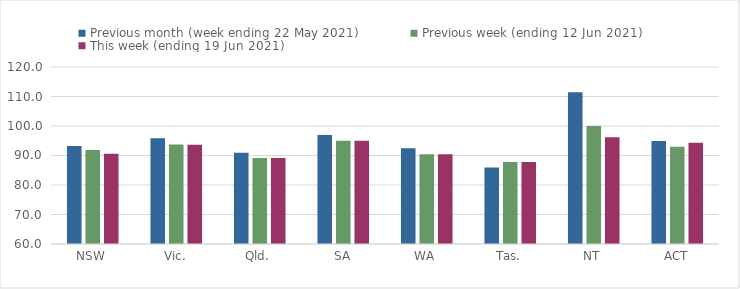
| Category | Previous month (week ending 22 May 2021) | Previous week (ending 12 Jun 2021) | This week (ending 19 Jun 2021) |
|---|---|---|---|
| NSW | 93.19 | 91.86 | 90.59 |
| Vic. | 95.84 | 93.71 | 93.65 |
| Qld. | 90.93 | 89.19 | 89.19 |
| SA | 96.93 | 95.04 | 95.04 |
| WA | 92.42 | 90.41 | 90.41 |
| Tas. | 85.9 | 87.82 | 87.82 |
| NT | 111.4 | 100 | 96.18 |
| ACT | 94.91 | 92.93 | 94.3 |